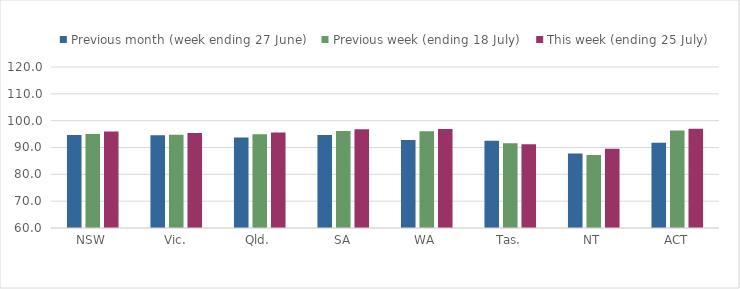
| Category | Previous month (week ending 27 June) | Previous week (ending 18 July) | This week (ending 25 July) |
|---|---|---|---|
| NSW | 94.66 | 95.036 | 95.975 |
| Vic. | 94.539 | 94.738 | 95.442 |
| Qld. | 93.691 | 94.967 | 95.635 |
| SA | 94.618 | 96.15 | 96.764 |
| WA | 92.83 | 96.069 | 96.922 |
| Tas. | 92.521 | 91.63 | 91.189 |
| NT | 87.785 | 87.215 | 89.541 |
| ACT | 91.771 | 96.343 | 96.987 |